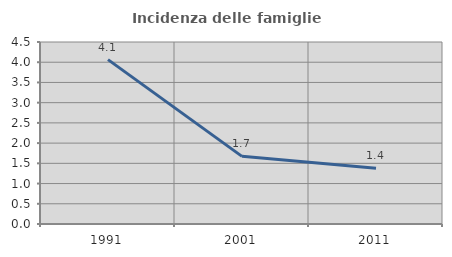
| Category | Incidenza delle famiglie numerose |
|---|---|
| 1991.0 | 4.064 |
| 2001.0 | 1.672 |
| 2011.0 | 1.378 |